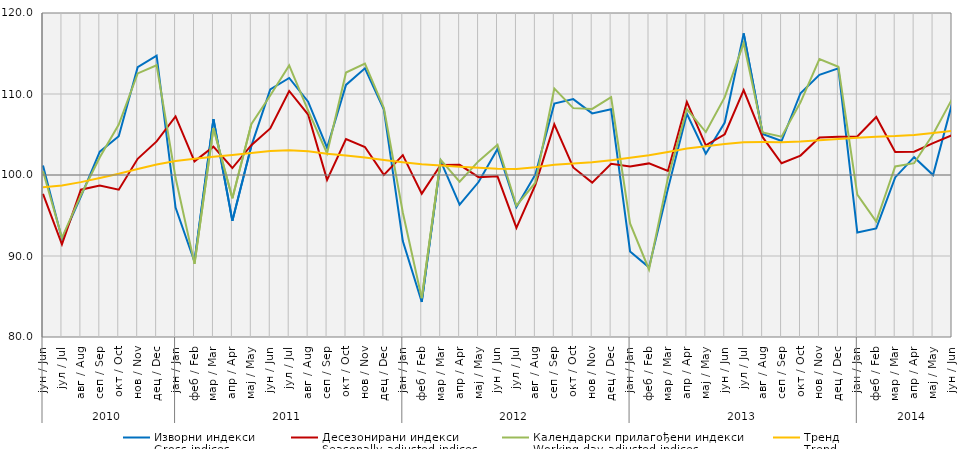
| Category | Изворни индекси
Gross indices | Десезонирани индекси
Seasonally adjusted indices | Календарски прилагођени индекси
Working-day adjusted indices | Тренд
Trend |
|---|---|---|---|---|
| 0 | 101.158 | 97.678 | 100.469 | 98.499 |
| 1 | 92.091 | 91.433 | 92.249 | 98.694 |
| 2 | 97.34 | 98.184 | 97.506 | 99.122 |
| 3 | 102.887 | 98.704 | 102.186 | 99.62 |
| 4 | 104.784 | 98.181 | 106.226 | 100.15 |
| 5 | 113.309 | 101.996 | 112.537 | 100.737 |
| 6 | 114.724 | 104.142 | 113.554 | 101.299 |
| 7 | 95.976 | 107.238 | 99.653 | 101.729 |
| 8 | 89.293 | 101.68 | 89.028 | 102.011 |
| 9 | 106.89 | 103.497 | 105.8 | 102.248 |
| 10 | 94.359 | 100.861 | 97.14 | 102.479 |
| 11 | 103.572 | 103.678 | 106.262 | 102.726 |
| 12 | 110.572 | 105.753 | 109.819 | 102.957 |
| 13 | 111.982 | 110.371 | 113.524 | 103.061 |
| 14 | 109.048 | 107.464 | 107.935 | 102.918 |
| 15 | 103.369 | 99.405 | 102.665 | 102.637 |
| 16 | 111.125 | 104.445 | 112.655 | 102.416 |
| 17 | 113.167 | 103.461 | 113.749 | 102.154 |
| 18 | 108.083 | 100.012 | 108.268 | 101.85 |
| 19 | 91.849 | 102.449 | 95.367 | 101.58 |
| 20 | 84.325 | 97.697 | 84.788 | 101.328 |
| 21 | 101.706 | 101.23 | 101.88 | 101.166 |
| 22 | 96.339 | 101.253 | 99.179 | 101.03 |
| 23 | 99.133 | 99.737 | 101.707 | 100.892 |
| 24 | 103.214 | 99.83 | 103.745 | 100.782 |
| 25 | 96.046 | 93.466 | 96.21 | 100.753 |
| 26 | 100.071 | 98.791 | 99.05 | 100.961 |
| 27 | 108.809 | 106.246 | 110.684 | 101.252 |
| 28 | 109.371 | 100.928 | 108.256 | 101.413 |
| 29 | 107.609 | 99.06 | 108.162 | 101.577 |
| 30 | 108.112 | 101.377 | 109.6 | 101.83 |
| 31 | 90.559 | 101.05 | 94.028 | 102.124 |
| 32 | 88.596 | 101.432 | 88.334 | 102.443 |
| 33 | 98.288 | 100.499 | 99.641 | 102.839 |
| 34 | 107.567 | 109.02 | 108.119 | 103.265 |
| 35 | 102.635 | 103.661 | 105.3 | 103.563 |
| 36 | 106.478 | 105.03 | 109.616 | 103.824 |
| 37 | 117.488 | 110.485 | 116.289 | 104.034 |
| 38 | 105.073 | 104.673 | 105.253 | 104.06 |
| 39 | 104.198 | 101.445 | 104.734 | 104.048 |
| 40 | 110.096 | 102.4 | 108.973 | 104.134 |
| 41 | 112.368 | 104.637 | 114.305 | 104.286 |
| 42 | 113.169 | 104.709 | 113.363 | 104.436 |
| 43 | 92.9 | 104.76 | 97.58 | 104.588 |
| 44 | 93.4 | 107.167 | 94.253 | 104.719 |
| 45 | 99.7 | 102.833 | 101.055 | 104.804 |
| 46 | 102.2 | 102.875 | 101.46 | 104.942 |
| 47 | 100 | 103.94 | 105.037 | 105.173 |
| 48 | 108.8 | 104.923 | 109.365 | 105.454 |